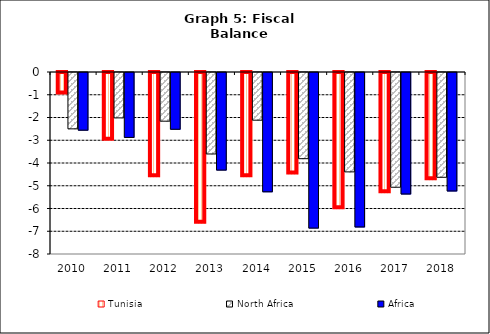
| Category | Tunisia | North Africa | Africa |
|---|---|---|---|
| 2010.0 | -0.946 | -2.477 | -2.535 |
| 2011.0 | -2.976 | -1.995 | -2.853 |
| 2012.0 | -4.577 | -2.14 | -2.495 |
| 2013.0 | -6.631 | -3.581 | -4.291 |
| 2014.0 | -4.581 | -2.096 | -5.245 |
| 2015.0 | -4.462 | -3.788 | -6.84 |
| 2016.0 | -5.992 | -4.368 | -6.79 |
| 2017.0 | -5.287 | -5.043 | -5.342 |
| 2018.0 | -4.71 | -4.606 | -5.208 |